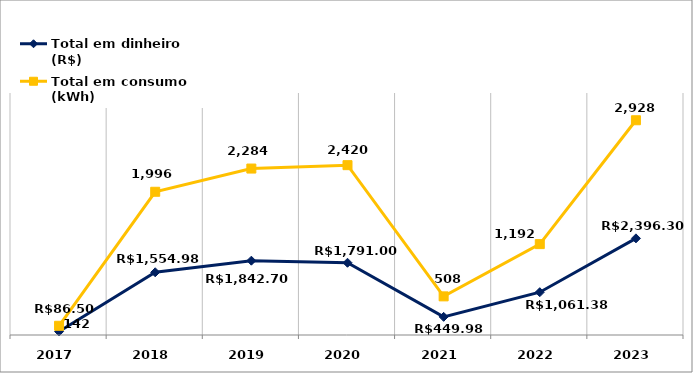
| Category | Total em dinheiro (R$) | Total em consumo (kWh) |
|---|---|---|
| 2017.0 | 86.5 | 142 |
| 2018.0 | 1554.98 | 1996 |
| 2019.0 | 1842.7 | 2284 |
| 2020.0 | 1791 | 2420 |
| 2021.0 | 449.98 | 508 |
| 2022.0 | 1061.38 | 1192 |
| 2023.0 | 2396.3 | 2928 |